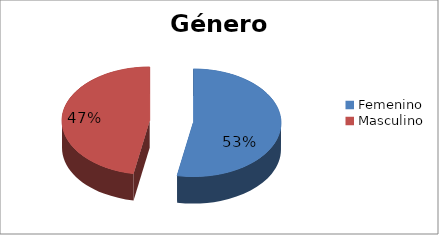
| Category | Series 0 |
|---|---|
| Femenino  | 9 |
| Masculino  | 8 |